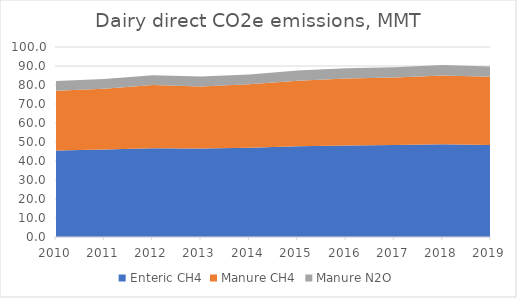
| Category | Enteric CH4 | Manure CH4 | Manure N2O |
|---|---|---|---|
| 2010.0 | 45.556 | 31.472 | 5.035 |
| 2011.0 | 46.06 | 32.032 | 5.115 |
| 2012.0 | 46.76 | 33.264 | 5.168 |
| 2013.0 | 46.592 | 32.676 | 5.141 |
| 2014.0 | 47.012 | 33.32 | 5.194 |
| 2015.0 | 47.768 | 34.524 | 5.326 |
| 2016.0 | 48.216 | 35.252 | 5.38 |
| 2017.0 | 48.44 | 35.56 | 5.406 |
| 2018.0 | 48.832 | 36.176 | 5.459 |
| 2019.0 | 48.412 | 35.868 | 5.38 |